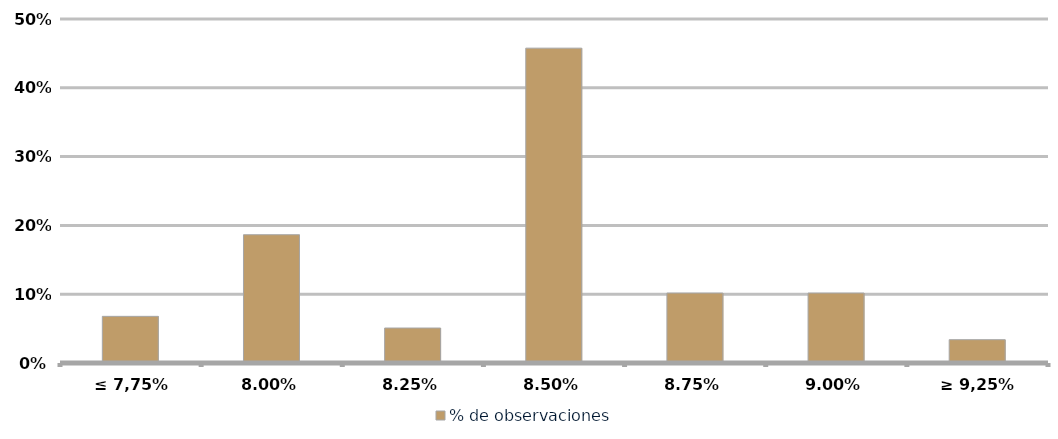
| Category | % de observaciones  |
|---|---|
| ≤ 7,75% | 0.068 |
| 8,00% | 0.186 |
| 8,25% | 0.051 |
| 8,50% | 0.458 |
| 8,75% | 0.102 |
| 9,00% | 0.102 |
| ≥ 9,25% | 0.034 |